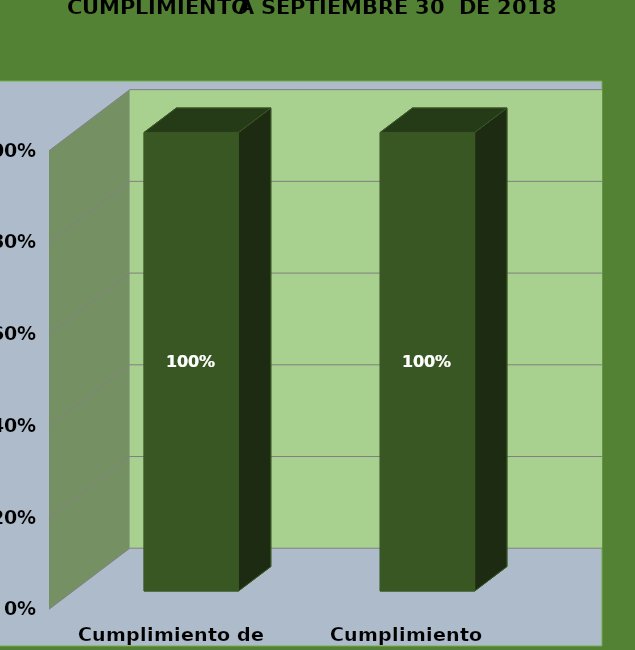
| Category | 30-sep.-18 |
|---|---|
| Cumplimiento de Hitos | 1 |
| Cumplimiento Temporal | 1 |